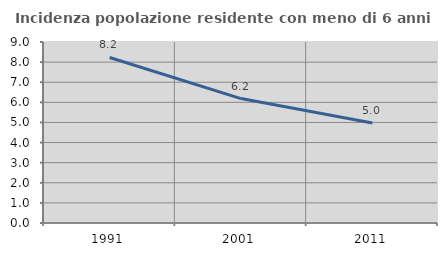
| Category | Incidenza popolazione residente con meno di 6 anni |
|---|---|
| 1991.0 | 8.23 |
| 2001.0 | 6.186 |
| 2011.0 | 4.972 |